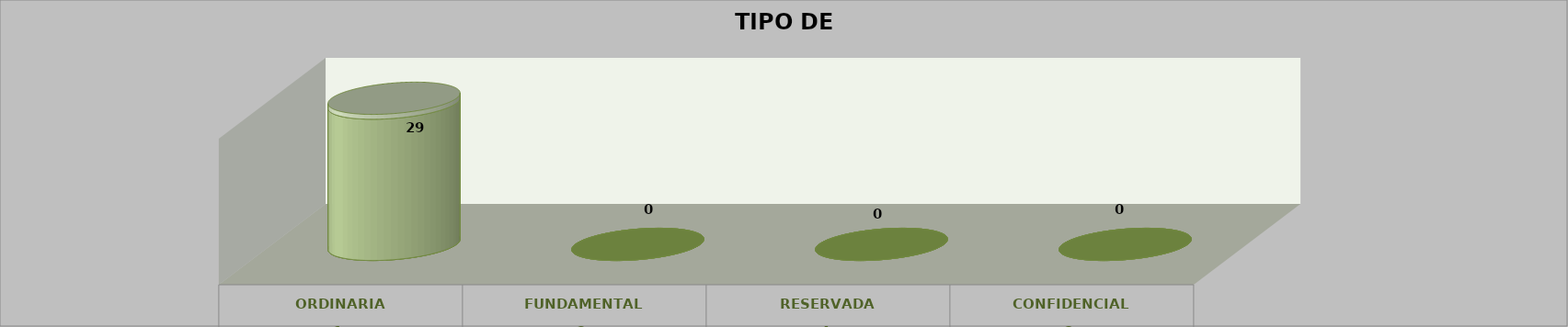
| Category | Series 0 | Series 2 | Series 1 | Series 3 | Series 4 |
|---|---|---|---|---|---|
| 0 |  |  |  | 29 | 1 |
| 1 |  |  |  | 0 | 0 |
| 2 |  |  |  | 0 | 0 |
| 3 |  |  |  | 0 | 0 |